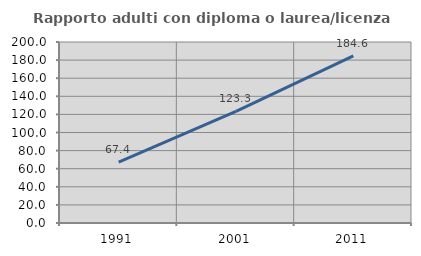
| Category | Rapporto adulti con diploma o laurea/licenza media  |
|---|---|
| 1991.0 | 67.382 |
| 2001.0 | 123.333 |
| 2011.0 | 184.578 |